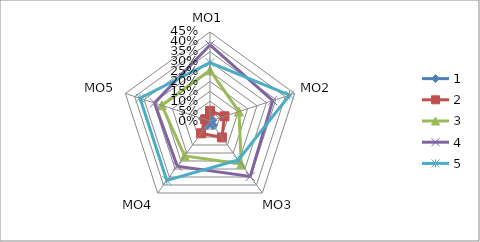
| Category | 1 | 2 | 3 | 4 | 5 |
|---|---|---|---|---|---|
| MO1 | 0.013 | 0.051 | 0.256 | 0.385 | 0.295 |
| MO2 | 0.013 | 0.077 | 0.154 | 0.333 | 0.423 |
| MO3 | 0.026 | 0.103 | 0.269 | 0.346 | 0.244 |
| MO4 | 0.026 | 0.077 | 0.218 | 0.282 | 0.372 |
| MO5 | 0.038 | 0.026 | 0.256 | 0.295 | 0.372 |